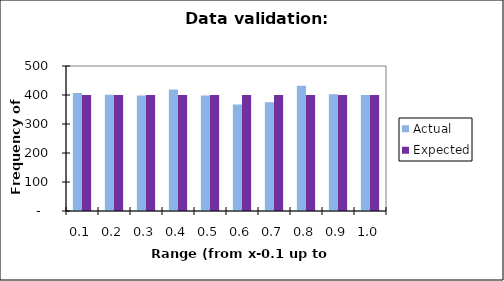
| Category | Actual | Expected |
|---|---|---|
| 0.1 | 407 | 400 |
| 0.2 | 401 | 400 |
| 0.30000000000000004 | 398 | 400 |
| 0.4 | 419 | 400 |
| 0.5 | 398 | 400 |
| 0.6 | 367 | 400 |
| 0.7 | 375 | 400 |
| 0.7999999999999999 | 432 | 400 |
| 0.8999999999999999 | 403 | 400 |
| 0.9999999999999999 | 400 | 400 |